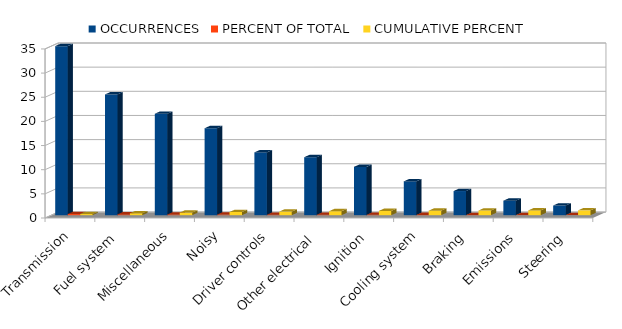
| Category | OCCURRENCES | PERCENT OF TOTAL | CUMULATIVE PERCENT |
|---|---|---|---|
| Transmission | 35 | 0.232 | 0.232 |
| Fuel system | 25 | 0.166 | 0.397 |
| Miscellaneous | 21 | 0.139 | 0.536 |
| Noisy | 18 | 0.119 | 0.656 |
| Driver controls | 13 | 0.086 | 0.742 |
| Other electrical | 12 | 0.079 | 0.821 |
| Ignition | 10 | 0.066 | 0.887 |
| Cooling system | 7 | 0.046 | 0.934 |
| Braking | 5 | 0.033 | 0.967 |
| Emissions | 3 | 0.02 | 0.987 |
| Steering | 2 | 0.013 | 1 |